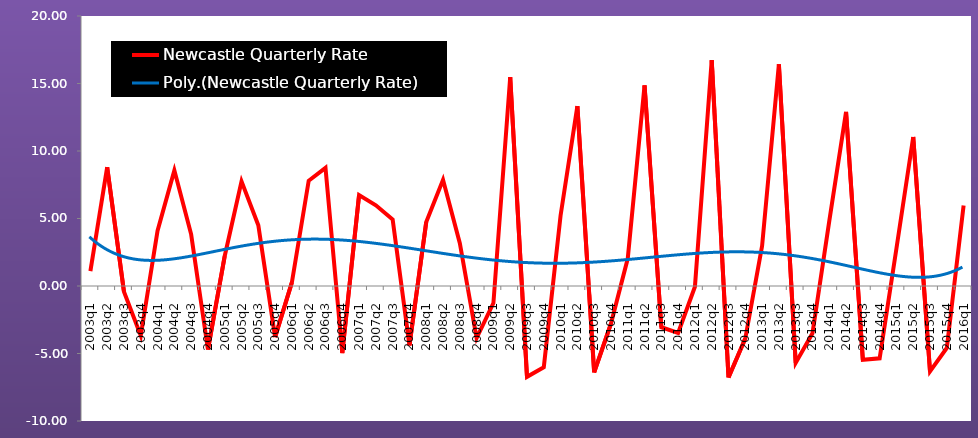
| Category | Newcastle Quarterly Rate |
|---|---|
| 2003q1 | 1.098 |
| 2003q2 | 8.804 |
| 2003q3 | -0.426 |
| 2003q4 | -3.68 |
| 2004q1 | 4.091 |
| 2004q2 | 8.565 |
| 2004q3 | 3.826 |
| 2004q4 | -4.708 |
| 2005q1 | 2.222 |
| 2005q2 | 7.753 |
| 2005q3 | 4.504 |
| 2005q4 | -3.79 |
| 2006q1 | 0.268 |
| 2006q2 | 7.797 |
| 2006q3 | 8.753 |
| 2006q4 | -4.973 |
| 2007q1 | 6.736 |
| 2007q2 | 5.975 |
| 2007q3 | 4.922 |
| 2007q4 | -4.398 |
| 2008q1 | 4.737 |
| 2008q2 | 7.865 |
| 2008q3 | 3.176 |
| 2008q4 | -3.862 |
| 2009q1 | -1.265 |
| 2009q2 | 15.47 |
| 2009q3 | -6.729 |
| 2009q4 | -6.015 |
| 2010q1 | 5.222 |
| 2010q2 | 13.324 |
| 2010q3 | -6.401 |
| 2010q4 | -2.786 |
| 2011q1 | 2.032 |
| 2011q2 | 14.864 |
| 2011q3 | -3.054 |
| 2011q4 | -3.479 |
| 2012q1 | -0.055 |
| 2012q2 | 16.727 |
| 2012q3 | -6.775 |
| 2012q4 | -3.889 |
| 2013q1 | 2.972 |
| 2013q2 | 16.425 |
| 2013q3 | -5.698 |
| 2013q4 | -3.5 |
| 2014q1 | 4.807 |
| 2014q2 | 12.899 |
| 2014q3 | -5.463 |
| 2014q4 | -5.356 |
| 2015q1 | 2.776 |
| 2015q2 | 11.037 |
| 2015q3 | -6.325 |
| 2015q4 | -4.592 |
| 2016q1 | 5.963 |